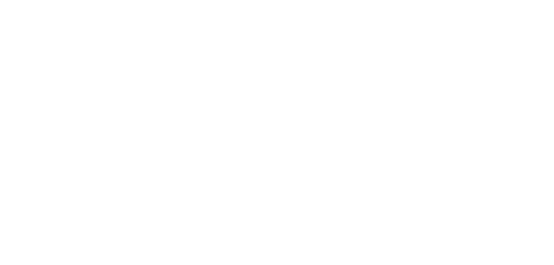
| Category | Series 1 |
|---|---|
| Sí | 0 |
| No | 0 |